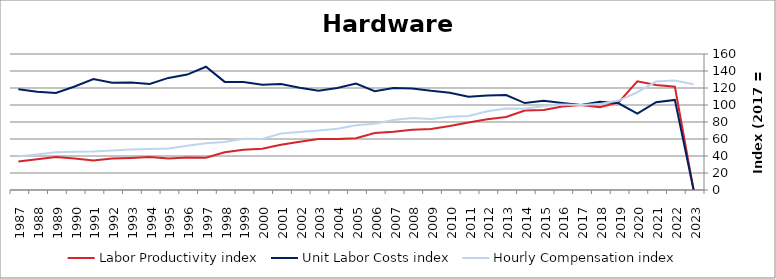
| Category | Labor Productivity index | Unit Labor Costs index | Hourly Compensation index |
|---|---|---|---|
| 2023.0 | 0 | 0 | 124.484 |
| 2022.0 | 121.559 | 105.987 | 128.836 |
| 2021.0 | 123.473 | 103.351 | 127.61 |
| 2020.0 | 127.951 | 89.893 | 115.019 |
| 2019.0 | 103.142 | 102.008 | 105.213 |
| 2018.0 | 97.511 | 103.829 | 101.245 |
| 2017.0 | 100 | 100 | 100 |
| 2016.0 | 98.187 | 102.423 | 100.566 |
| 2015.0 | 94.194 | 104.891 | 98.801 |
| 2014.0 | 93.582 | 102.253 | 95.69 |
| 2013.0 | 85.896 | 111.632 | 95.888 |
| 2012.0 | 83.277 | 111.32 | 92.704 |
| 2011.0 | 79.499 | 109.628 | 87.153 |
| 2010.0 | 75.186 | 114.499 | 86.087 |
| 2009.0 | 71.661 | 116.669 | 83.606 |
| 2008.0 | 71.008 | 119.462 | 84.828 |
| 2007.0 | 68.588 | 119.935 | 82.26 |
| 2006.0 | 66.937 | 116.275 | 77.831 |
| 2005.0 | 60.883 | 125.119 | 76.176 |
| 2004.0 | 60.03 | 120.118 | 72.107 |
| 2003.0 | 59.947 | 116.653 | 69.931 |
| 2002.0 | 56.767 | 120.363 | 68.326 |
| 2001.0 | 53.197 | 124.761 | 66.369 |
| 2000.0 | 48.619 | 123.696 | 60.14 |
| 1999.0 | 47.43 | 127.167 | 60.316 |
| 1998.0 | 44.509 | 127.176 | 56.605 |
| 1997.0 | 38.006 | 144.997 | 55.107 |
| 1996.0 | 38.307 | 135.756 | 52.004 |
| 1995.0 | 37.136 | 131.858 | 48.967 |
| 1994.0 | 38.693 | 124.683 | 48.244 |
| 1993.0 | 37.608 | 126.434 | 47.549 |
| 1992.0 | 36.965 | 126.087 | 46.608 |
| 1991.0 | 34.722 | 130.433 | 45.289 |
| 1990.0 | 36.991 | 121.785 | 45.049 |
| 1989.0 | 38.83 | 114.247 | 44.362 |
| 1988.0 | 36.212 | 115.6 | 41.862 |
| 1987.0 | 33.57 | 118.439 | 39.76 |